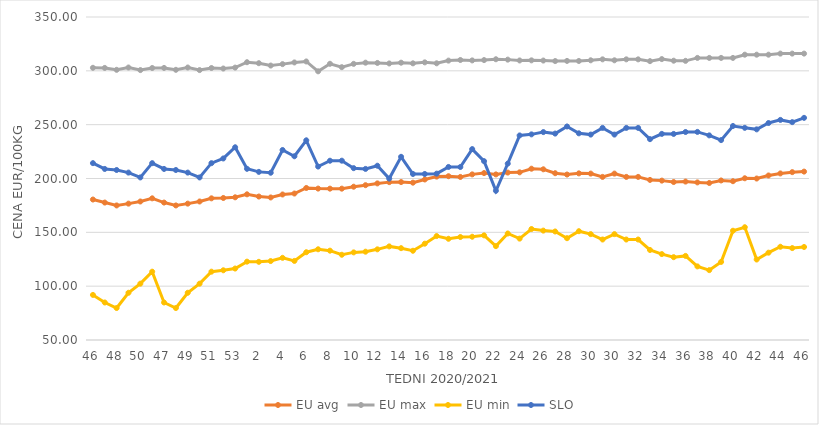
| Category | EU avg | EU max | EU min | SLO |
|---|---|---|---|---|
| 46.0 | 180.473 | 302.82 | 91.889 | 214.27 |
| 47.0 | 177.656 | 302.7 | 84.832 | 208.87 |
| 48.0 | 174.977 | 300.94 | 79.697 | 207.9 |
| 49.0 | 176.65 | 303.09 | 93.873 | 205.48 |
| 50.0 | 178.648 | 300.7 | 102.316 | 200.99 |
| 51.0 | 181.58 | 302.62 | 113.46 | 214.25 |
| 47.0 | 177.656 | 302.7 | 84.832 | 208.87 |
| 48.0 | 174.977 | 300.94 | 79.697 | 207.9 |
| 49.0 | 176.65 | 303.09 | 93.873 | 205.48 |
| 50.0 | 178.648 | 300.7 | 102.316 | 200.99 |
| 51.0 | 181.58 | 302.62 | 113.46 | 214.25 |
| 52.0 | 181.9 | 302.14 | 114.76 | 218.61 |
| 53.0 | 182.536 | 303 | 116.375 | 229 |
| 1.0 | 185.3 | 308 | 122.769 | 209 |
| 2.0 | 183.25 | 307.1 | 122.609 | 206.15 |
| 3.0 | 182.393 | 304.91 | 123.32 | 205.35 |
| 4.0 | 185.158 | 306.22 | 126.329 | 226.48 |
| 5.0 | 186.04 | 307.79 | 123.461 | 220.65 |
| 6.0 | 191.206 | 308.7 | 131.528 | 235.46 |
| 7.0 | 190.629 | 299.55 | 134.262 | 211.1 |
| 8.0 | 190.57 | 306.55 | 132.97 | 216.51 |
| 9.0 | 190.562 | 303.4 | 129.173 | 216.54 |
| 10.0 | 192.373 | 306.48 | 131.374 | 209.61 |
| 11.0 | 193.79 | 307.58 | 132.024 | 208.91 |
| 12.0 | 195.449 | 307.33 | 134.212 | 211.87 |
| 13.0 | 196.631 | 306.85 | 136.936 | 199.93 |
| 14.0 | 196.702 | 307.56 | 135.297 | 220.15 |
| 15.0 | 196.13 | 306.96 | 132.893 | 204.2 |
| 16.0 | 199.1 | 307.87 | 139.462 | 204.2 |
| 17.0 | 201.754 | 306.98 | 146.538 | 204.51 |
| 18.0 | 202.13 | 309.49 | 144.017 | 210.72 |
| 19.0 | 201.439 | 310.06 | 145.644 | 210.68 |
| 20.0 | 203.834 | 309.69 | 145.911 | 227.32 |
| 21.0 | 205.04 | 309.99 | 147.188 | 216.08 |
| 22.0 | 203.79 | 310.76 | 137.177 | 188.6 |
| 23.0 | 205.51 | 310.41 | 148.928 | 213.84 |
| 24.0 | 205.73 | 309.64 | 144.161 | 239.99 |
| 25.0 | 209.095 | 309.74 | 153.081 | 240.99 |
| 26.0 | 208.551 | 309.55 | 151.599 | 243.11 |
| 27.0 | 204.914 | 309.08 | 150.789 | 241.72 |
| 28.0 | 203.681 | 309.21 | 144.56 | 248.33 |
| 29.0 | 204.773 | 309.15 | 151.052 | 241.96 |
| 30.0 | 204.558 | 309.78 | 148.33 | 240.79 |
| 31.0 | 201.483 | 310.67 | 143.33 | 247 |
| 30.0 | 204.558 | 309.78 | 148.33 | 240.79 |
| 31.0 | 201.483 | 310.67 | 143.33 | 247 |
| 32.0 | 201.483 | 310.67 | 143.33 | 247 |
| 33.0 | 198.691 | 309 | 133.607 | 236.54 |
| 34.0 | 198.027 | 310.9 | 129.797 | 241.45 |
| 35.0 | 196.72 | 309.41 | 126.926 | 241.39 |
| 36.0 | 197.157 | 309.28 | 128.099 | 243.19 |
| 37.0 | 196.375 | 312 | 118.364 | 243.28 |
| 38.0 | 195.821 | 312 | 114.892 | 240.06 |
| 39.0 | 198.179 | 312 | 122.517 | 235.66 |
| 40.0 | 197.482 | 312 | 151.488 | 248.77 |
| 41.0 | 200.22 | 315 | 154.74 | 247.07 |
| 42.0 | 199.965 | 315 | 124.748 | 245.64 |
| 43.0 | 202.804 | 315 | 131.104 | 251.53 |
| 44.0 | 204.713 | 316 | 136.6 | 254.42 |
| 45.0 | 205.906 | 316 | 135.362 | 252.35 |
| 46.0 | 206.4 | 316 | 136.39 | 256.33 |